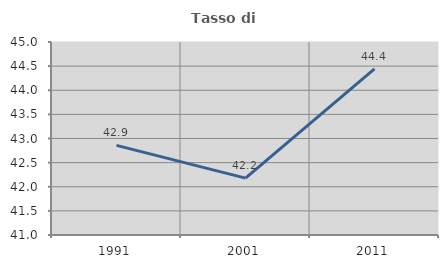
| Category | Tasso di occupazione   |
|---|---|
| 1991.0 | 42.857 |
| 2001.0 | 42.179 |
| 2011.0 | 44.444 |